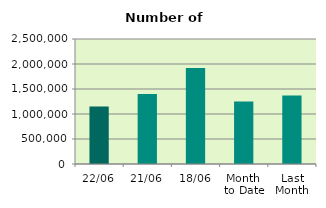
| Category | Series 0 |
|---|---|
| 22/06 | 1150102 |
| 21/06 | 1398698 |
| 18/06 | 1919770 |
| Month 
to Date | 1251384.125 |
| Last
Month | 1368600.286 |